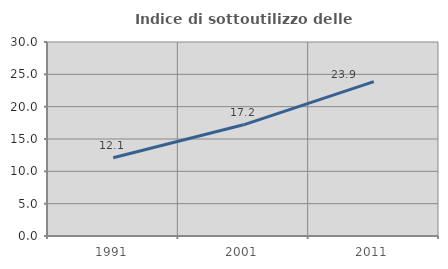
| Category | Indice di sottoutilizzo delle abitazioni  |
|---|---|
| 1991.0 | 12.102 |
| 2001.0 | 17.194 |
| 2011.0 | 23.884 |